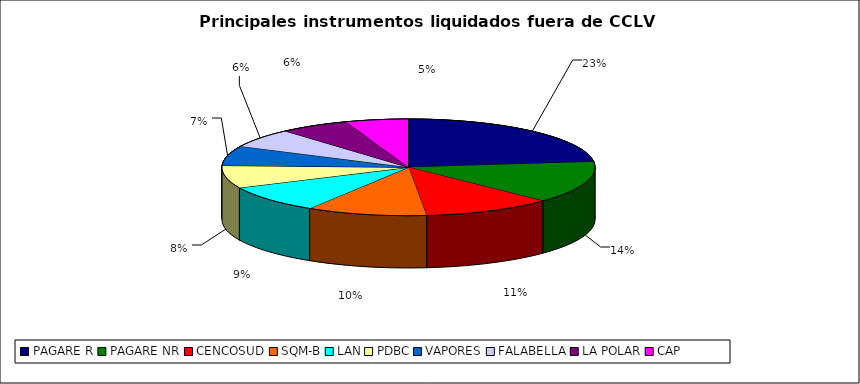
| Category | Series 0 |
|---|---|
| PAGARE R | 2156 |
| PAGARE NR | 1315 |
| CENCOSUD | 1048 |
| SQM-B | 974 |
| LAN | 855 |
| PDBC | 704 |
| VAPORES | 617 |
| FALABELLA | 587 |
| LA POLAR | 563 |
| CAP | 508 |